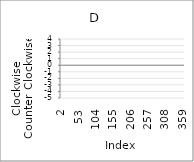
| Category | Series 0 |
|---|---|
| 2.0 | 1 |
| 3.0 | -4 |
| 4.0 | 3 |
| 5.0 | -4 |
| 6.0 | -5 |
| 7.0 | 0 |
| 8.0 | -3 |
| 9.0 | -2 |
| 10.0 | -5 |
| 11.0 | 2 |
| 12.0 | -3 |
| 13.0 | -1 |
| 14.0 | -2 |
| 15.0 | -4 |
| 16.0 | 3 |
| 17.0 | -1 |
| 18.0 | 4 |
| 19.0 | 3 |
| 20.0 | 4 |
| 21.0 | 2 |
| 22.0 | 3 |
| 23.0 | -2 |
| 24.0 | -5 |
| 25.0 | -5 |
| 26.0 | -3 |
| 27.0 | -5 |
| 28.0 | -1 |
| 29.0 | 4 |
| 30.0 | -2 |
| 31.0 | -2 |
| 32.0 | -1 |
| 33.0 | -1 |
| 34.0 | -3 |
| 35.0 | 1 |
| 36.0 | 4 |
| 37.0 | 3 |
| 38.0 | 3 |
| 39.0 | -1 |
| 40.0 | -4 |
| 41.0 | -5 |
| 42.0 | -1 |
| 43.0 | 1 |
| 44.0 | -1 |
| 45.0 | 4 |
| 46.0 | -2 |
| 47.0 | -3 |
| 48.0 | 1 |
| 49.0 | -5 |
| 50.0 | -1 |
| 51.0 | 3 |
| 52.0 | 1 |
| 53.0 | -2 |
| 54.0 | 4 |
| 55.0 | 0 |
| 56.0 | 4 |
| 57.0 | -4 |
| 58.0 | -4 |
| 59.0 | 3 |
| 60.0 | 0 |
| 61.0 | -5 |
| 62.0 | -5 |
| 63.0 | -3 |
| 64.0 | 0 |
| 65.0 | -4 |
| 66.0 | 1 |
| 67.0 | -4 |
| 68.0 | 2 |
| 69.0 | -5 |
| 70.0 | -4 |
| 71.0 | -2 |
| 72.0 | -1 |
| 73.0 | 4 |
| 74.0 | 2 |
| 75.0 | -3 |
| 76.0 | -4 |
| 77.0 | -1 |
| 78.0 | 2 |
| 79.0 | -1 |
| 80.0 | -4 |
| 81.0 | -4 |
| 82.0 | 2 |
| 83.0 | -3 |
| 84.0 | 2 |
| 85.0 | 1 |
| 86.0 | -3 |
| 87.0 | -1 |
| 88.0 | -2 |
| 89.0 | 1 |
| 90.0 | -1 |
| 91.0 | -4 |
| 92.0 | 1 |
| 93.0 | 0 |
| 94.0 | -5 |
| 95.0 | -3 |
| 96.0 | 1 |
| 97.0 | 2 |
| 98.0 | -2 |
| 99.0 | 3 |
| 100.0 | 4 |
| 101.0 | 2 |
| 102.0 | -4 |
| 103.0 | -4 |
| 104.0 | 1 |
| 105.0 | -3 |
| 106.0 | -4 |
| 107.0 | 3 |
| 108.0 | 3 |
| 109.0 | 4 |
| 110.0 | 1 |
| 111.0 | -1 |
| 112.0 | -3 |
| 113.0 | -2 |
| 114.0 | -4 |
| 115.0 | -5 |
| 116.0 | 2 |
| 117.0 | -5 |
| 118.0 | 4 |
| 119.0 | -3 |
| 120.0 | -1 |
| 121.0 | 4 |
| 122.0 | 2 |
| 123.0 | 1 |
| 124.0 | -4 |
| 125.0 | 2 |
| 126.0 | -4 |
| 127.0 | -4 |
| 128.0 | 0 |
| 129.0 | 0 |
| 130.0 | -4 |
| 131.0 | 2 |
| 132.0 | 4 |
| 133.0 | 4 |
| 134.0 | 0 |
| 135.0 | 4 |
| 136.0 | 0 |
| 137.0 | -5 |
| 138.0 | -3 |
| 139.0 | -2 |
| 140.0 | 4 |
| 141.0 | -4 |
| 142.0 | 1 |
| 143.0 | 2 |
| 144.0 | 3 |
| 145.0 | -1 |
| 146.0 | 1 |
| 147.0 | 4 |
| 148.0 | 2 |
| 149.0 | 0 |
| 150.0 | -1 |
| 151.0 | -2 |
| 152.0 | -1 |
| 153.0 | 1 |
| 154.0 | -3 |
| 155.0 | 4 |
| 156.0 | -4 |
| 157.0 | -4 |
| 158.0 | -3 |
| 159.0 | -4 |
| 160.0 | 4 |
| 161.0 | -5 |
| 162.0 | 2 |
| 163.0 | 2 |
| 164.0 | -5 |
| 165.0 | 0 |
| 166.0 | -4 |
| 167.0 | 4 |
| 168.0 | -1 |
| 169.0 | -1 |
| 170.0 | 0 |
| 171.0 | -3 |
| 172.0 | -3 |
| 173.0 | 3 |
| 174.0 | 1 |
| 175.0 | 1 |
| 176.0 | -3 |
| 177.0 | 0 |
| 178.0 | 4 |
| 179.0 | 0 |
| 180.0 | 3 |
| 181.0 | -5 |
| 182.0 | -5 |
| 183.0 | -2 |
| 184.0 | 2 |
| 185.0 | 1 |
| 186.0 | -4 |
| 187.0 | 3 |
| 188.0 | -5 |
| 189.0 | 2 |
| 190.0 | 2 |
| 191.0 | 2 |
| 192.0 | -3 |
| 193.0 | -1 |
| 194.0 | 1 |
| 195.0 | -5 |
| 196.0 | -2 |
| 197.0 | 3 |
| 198.0 | 3 |
| 199.0 | 3 |
| 200.0 | 1 |
| 201.0 | 4 |
| 202.0 | -4 |
| 203.0 | -4 |
| 204.0 | 1 |
| 205.0 | -5 |
| 206.0 | 2 |
| 207.0 | -4 |
| 208.0 | -3 |
| 209.0 | -2 |
| 210.0 | -3 |
| 211.0 | -4 |
| 212.0 | -4 |
| 213.0 | 1 |
| 214.0 | -4 |
| 215.0 | -3 |
| 216.0 | 0 |
| 217.0 | -2 |
| 218.0 | -1 |
| 219.0 | -5 |
| 220.0 | 2 |
| 221.0 | 1 |
| 222.0 | 3 |
| 223.0 | 1 |
| 224.0 | 0 |
| 225.0 | -1 |
| 226.0 | 2 |
| 227.0 | 4 |
| 228.0 | 1 |
| 229.0 | 1 |
| 230.0 | 0 |
| 231.0 | 3 |
| 232.0 | -5 |
| 233.0 | 0 |
| 234.0 | 3 |
| 235.0 | -3 |
| 236.0 | -1 |
| 237.0 | -1 |
| 238.0 | 1 |
| 239.0 | 1 |
| 240.0 | -4 |
| 241.0 | 0 |
| 242.0 | 3 |
| 243.0 | -2 |
| 244.0 | -1 |
| 245.0 | 1 |
| 246.0 | -4 |
| 247.0 | -4 |
| 248.0 | 3 |
| 249.0 | 4 |
| 250.0 | 3 |
| 251.0 | -1 |
| 252.0 | 1 |
| 253.0 | -3 |
| 254.0 | -2 |
| 255.0 | 0 |
| 256.0 | -5 |
| 257.0 | 0 |
| 258.0 | -4 |
| 259.0 | -1 |
| 260.0 | -4 |
| 261.0 | -2 |
| 262.0 | 4 |
| 263.0 | -2 |
| 264.0 | 2 |
| 265.0 | 4 |
| 266.0 | -1 |
| 267.0 | -3 |
| 268.0 | -5 |
| 269.0 | 1 |
| 270.0 | 0 |
| 271.0 | -4 |
| 272.0 | -1 |
| 273.0 | 3 |
| 274.0 | 0 |
| 275.0 | 1 |
| 276.0 | 0 |
| 277.0 | -3 |
| 278.0 | 1 |
| 279.0 | 4 |
| 280.0 | 2 |
| 281.0 | -2 |
| 282.0 | -3 |
| 283.0 | 4 |
| 284.0 | 4 |
| 285.0 | -5 |
| 286.0 | 1 |
| 287.0 | 1 |
| 288.0 | 4 |
| 289.0 | -4 |
| 290.0 | -4 |
| 291.0 | -2 |
| 292.0 | 3 |
| 293.0 | 0 |
| 294.0 | -3 |
| 295.0 | -4 |
| 296.0 | 0 |
| 297.0 | 1 |
| 298.0 | 0 |
| 299.0 | -5 |
| 300.0 | 2 |
| 301.0 | -4 |
| 302.0 | -2 |
| 303.0 | 3 |
| 304.0 | 2 |
| 305.0 | 4 |
| 306.0 | 3 |
| 307.0 | 0 |
| 308.0 | -4 |
| 309.0 | 1 |
| 310.0 | -5 |
| 311.0 | 2 |
| 312.0 | 0 |
| 313.0 | -5 |
| 314.0 | 3 |
| 315.0 | -3 |
| 316.0 | -2 |
| 317.0 | 2 |
| 318.0 | 3 |
| 319.0 | -1 |
| 320.0 | 1 |
| 321.0 | -5 |
| 322.0 | -2 |
| 323.0 | -4 |
| 324.0 | -5 |
| 325.0 | 2 |
| 326.0 | 0 |
| 327.0 | 2 |
| 328.0 | -5 |
| 329.0 | 4 |
| 330.0 | 4 |
| 331.0 | 0 |
| 332.0 | -3 |
| 333.0 | 4 |
| 334.0 | 2 |
| 335.0 | -4 |
| 336.0 | -5 |
| 337.0 | 0 |
| 338.0 | -2 |
| 339.0 | 0 |
| 340.0 | -4 |
| 341.0 | -5 |
| 342.0 | -2 |
| 343.0 | -3 |
| 344.0 | 2 |
| 345.0 | 0 |
| 346.0 | 0 |
| 347.0 | 4 |
| 348.0 | -5 |
| 349.0 | 2 |
| 350.0 | 3 |
| 351.0 | -2 |
| 352.0 | -5 |
| 353.0 | 0 |
| 354.0 | 4 |
| 355.0 | -3 |
| 356.0 | -1 |
| 357.0 | 3 |
| 358.0 | -1 |
| 359.0 | -2 |
| 360.0 | 4 |
| 361.0 | -1 |
| 362.0 | -3 |
| 363.0 | 2 |
| 364.0 | -1 |
| 365.0 | -1 |